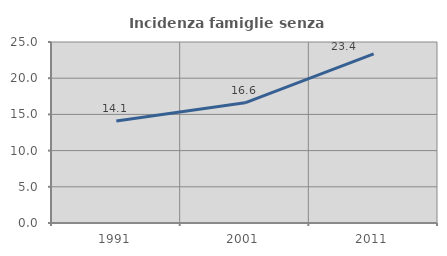
| Category | Incidenza famiglie senza nuclei |
|---|---|
| 1991.0 | 14.101 |
| 2001.0 | 16.595 |
| 2011.0 | 23.367 |